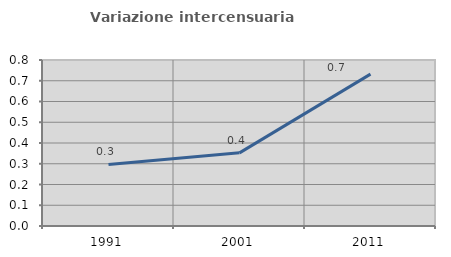
| Category | Variazione intercensuaria annua |
|---|---|
| 1991.0 | 0.297 |
| 2001.0 | 0.352 |
| 2011.0 | 0.732 |